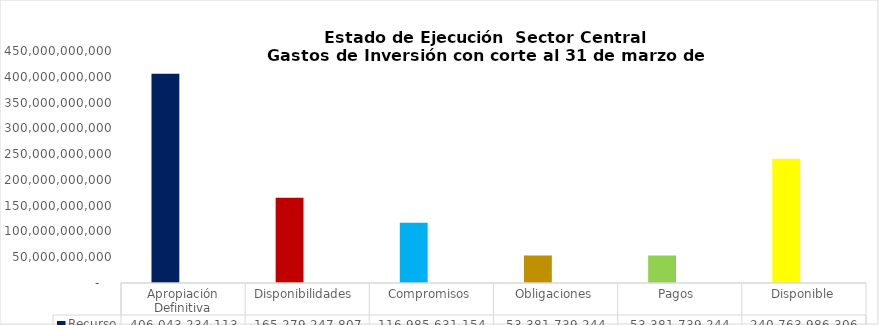
| Category | Recurso  | % |
|---|---|---|
| Apropiación Definitiva | 406043234113.47 | 1 |
| Disponibilidades  | 165279247807.49 | 0.407 |
| Compromisos | 116985631153.91 | 0.288 |
| Obligaciones | 53381739244.4 | 0.131 |
| Pagos  | 53381739244.4 | 0.131 |
| Disponible | 240763986305.98 | 0.593 |